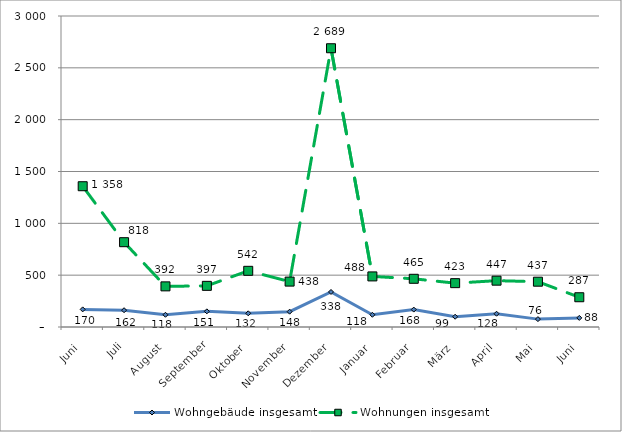
| Category | Wohngebäude insgesamt | Wohnungen insgesamt |
|---|---|---|
| Juni | 170 | 1358 |
| Juli | 162 | 818 |
| August | 118 | 392 |
| September | 151 | 397 |
| Oktober | 132 | 542 |
| November | 148 | 438 |
| Dezember | 338 | 2689 |
| Januar | 118 | 488 |
| Februar | 168 | 465 |
| März | 99 | 423 |
| April | 128 | 447 |
| Mai | 76 | 437 |
| Juni | 88 | 287 |